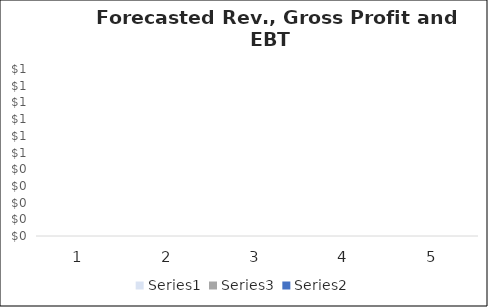
| Category | Series 0 | Series 2 | Series 1 |
|---|---|---|---|
| 0 | 10000 | 6300 | -28700 |
| 1 | 11000 | 6930 | -34070 |
| 2 | 12100 | 7744 | -34856 |
| 3 | 13310 | 8518.4 | -41041.6 |
| 4 | 14641 | 9516.65 | -38219.35 |